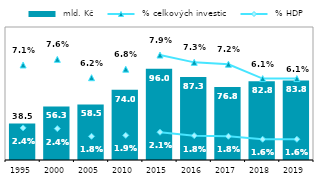
| Category |  mld. Kč |
|---|---|
| 1995 | 38.533 |
| 2000 | 56.326 |
| 2005 | 58.518 |
| 2010 | 74.018 |
| 2015 | 95.977 |
| 2016 | 87.256 |
| 2017 | 76.809 |
| 2018 | 82.84 |
| 2019 | 83.78 |